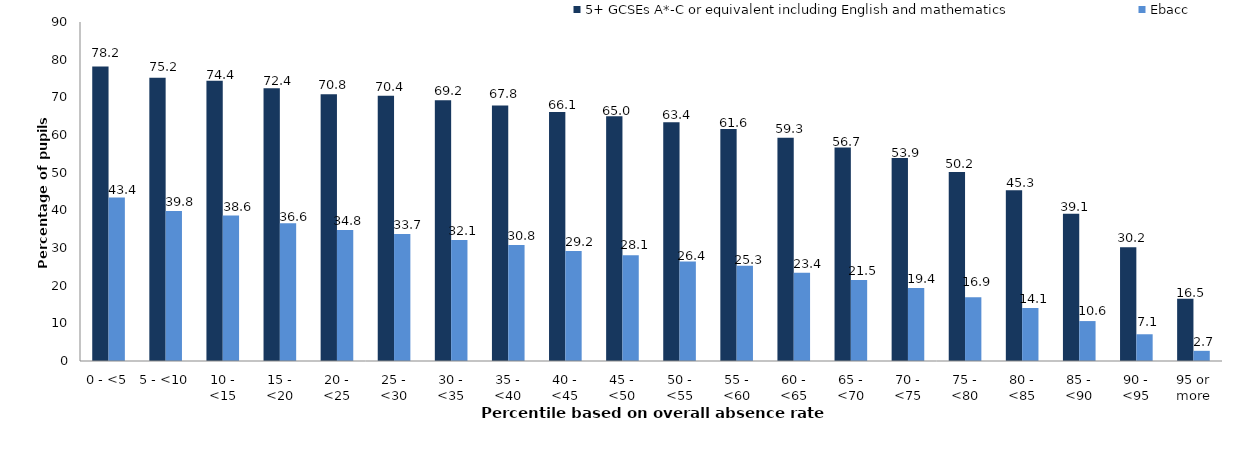
| Category | 5+ GCSEs A*-C or equivalent including English and mathematics | Ebacc |
|---|---|---|
| 0 - <5 | 78.2 | 43.4 |
| 5 - <10 | 75.2 | 39.8 |
| 10 - <15 | 74.4 | 38.6 |
| 15 - <20 | 72.4 | 36.6 |
| 20 - <25 | 70.8 | 34.8 |
| 25 - <30 | 70.4 | 33.7 |
| 30 - <35 | 69.2 | 32.1 |
| 35 - <40 | 67.8 | 30.8 |
| 40 - <45 | 66.1 | 29.2 |
| 45 - <50 | 65 | 28.1 |
| 50 - <55 | 63.4 | 26.4 |
| 55 - <60 | 61.6 | 25.3 |
| 60 - <65 | 59.3 | 23.4 |
| 65 - <70 | 56.7 | 21.5 |
| 70 - <75 | 53.9 | 19.4 |
| 75 - <80 | 50.2 | 16.9 |
| 80 - <85 | 45.3 | 14.1 |
| 85 - <90 | 39.1 | 10.6 |
| 90 - <95 | 30.2 | 7.1 |
| 95 or more | 16.5 | 2.7 |